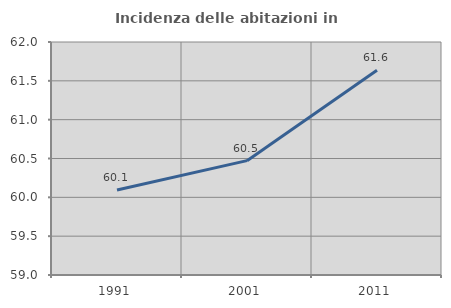
| Category | Incidenza delle abitazioni in proprietà  |
|---|---|
| 1991.0 | 60.094 |
| 2001.0 | 60.472 |
| 2011.0 | 61.636 |